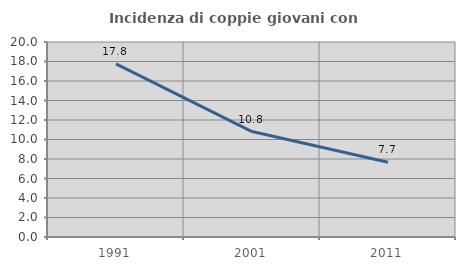
| Category | Incidenza di coppie giovani con figli |
|---|---|
| 1991.0 | 17.762 |
| 2001.0 | 10.815 |
| 2011.0 | 7.666 |